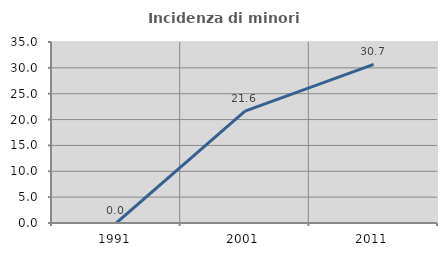
| Category | Incidenza di minori stranieri |
|---|---|
| 1991.0 | 0 |
| 2001.0 | 21.622 |
| 2011.0 | 30.671 |